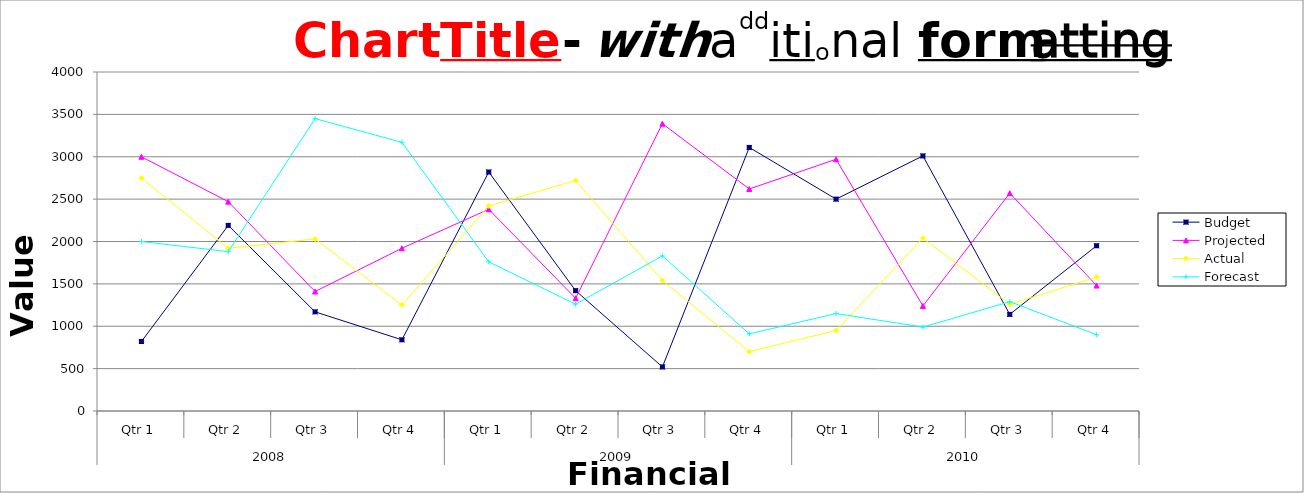
| Category | Budget | Projected | Actual | Forecast |
|---|---|---|---|---|
| 0 | 820 | 3000 | 2750 | 2000 |
| 1 | 2190 | 2470 | 1920 | 1880 |
| 2 | 1170 | 1410 | 2030 | 3450 |
| 3 | 840 | 1920 | 1250 | 3170 |
| 4 | 2820 | 2380 | 2420 | 1760 |
| 5 | 1420 | 1330 | 2720 | 1260 |
| 6 | 520 | 3390 | 1540 | 1830 |
| 7 | 3110 | 2620 | 700 | 910 |
| 8 | 2500 | 2970 | 950 | 1150 |
| 9 | 3010 | 1240 | 2040 | 990 |
| 10 | 1140 | 2570 | 1260 | 1290 |
| 11 | 1950 | 1480 | 1580 | 900 |